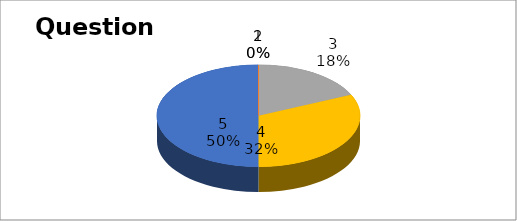
| Category | Series 0 |
|---|---|
| 0 | 0 |
| 1 | 0 |
| 2 | 4 |
| 3 | 7 |
| 4 | 11 |